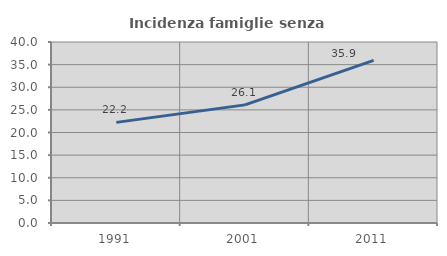
| Category | Incidenza famiglie senza nuclei |
|---|---|
| 1991.0 | 22.239 |
| 2001.0 | 26.106 |
| 2011.0 | 35.947 |